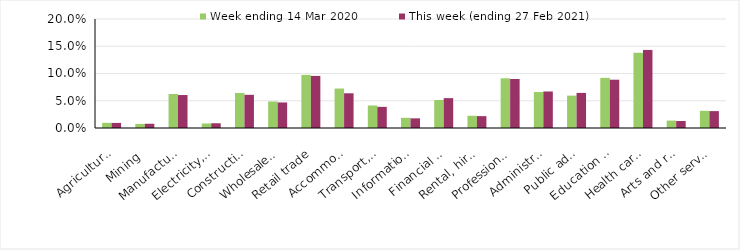
| Category | Week ending 14 Mar 2020 | This week (ending 27 Feb 2021) |
|---|---|---|
| Agriculture, forestry and fishing | 0.01 | 0.009 |
| Mining | 0.008 | 0.008 |
| Manufacturing | 0.062 | 0.06 |
| Electricity, gas, water and waste services | 0.008 | 0.009 |
| Construction | 0.064 | 0.061 |
| Wholesale trade | 0.049 | 0.047 |
| Retail trade | 0.097 | 0.096 |
| Accommodation and food services | 0.072 | 0.064 |
| Transport, postal and warehousing | 0.041 | 0.039 |
| Information media and telecommunications | 0.019 | 0.018 |
| Financial and insurance services | 0.051 | 0.055 |
| Rental, hiring and real estate services | 0.022 | 0.022 |
| Professional, scientific and technical services | 0.091 | 0.09 |
| Administrative and support services | 0.066 | 0.067 |
| Public administration and safety | 0.059 | 0.064 |
| Education and training | 0.092 | 0.089 |
| Health care and social assistance | 0.138 | 0.143 |
| Arts and recreation services | 0.014 | 0.013 |
| Other services | 0.032 | 0.031 |